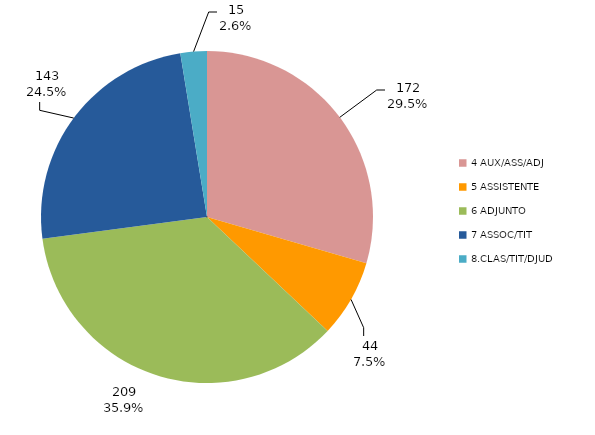
| Category | 2017 |
|---|---|
| 4 AUX/ASS/ADJ | 172 |
| 5 ASSISTENTE | 44 |
| 6 ADJUNTO | 209 |
| 7 ASSOC/TIT | 143 |
| 8.CLAS/TIT/DJUD | 15 |